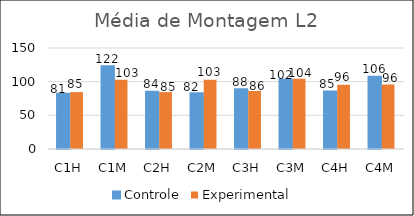
| Category | Controle | Experimental  |
|---|---|---|
| C1H | 81.25 | 84.501 |
| C1M | 122 | 102.977 |
| C2H | 84.25 | 84.5 |
| C2M | 82.15 | 102.912 |
| C3H | 88.1 | 86.2 |
| C3M | 102.3 | 104.3 |
| C4H | 84.55 | 95.575 |
| C4M | 106.45 | 95.828 |